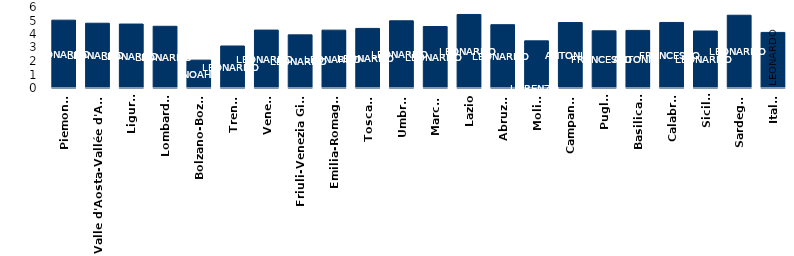
| Category | Nati Maschi |
|---|---|
| Piemonte | 5.025 |
| Valle d'Aosta-Vallée d'Aoste | 4.798 |
| Liguria | 4.737 |
| Lombardia | 4.571 |
| Bolzano-Bozen | 2.065 |
| Trento | 3.11 |
| Veneto | 4.288 |
| Friuli-Venezia Giulia | 3.935 |
| Emilia-Romagna | 4.287 |
| Toscana | 4.414 |
| Umbria | 4.977 |
| Marche | 4.554 |
| Lazio | 5.446 |
| Abruzzo | 4.689 |
| Molise | 3.492 |
| Campania | 4.849 |
| Puglia | 4.235 |
| Basilicata | 4.267 |
| Calabria | 4.855 |
| Sicilia | 4.222 |
| Sardegna | 5.389 |
| Italia | 4.117 |